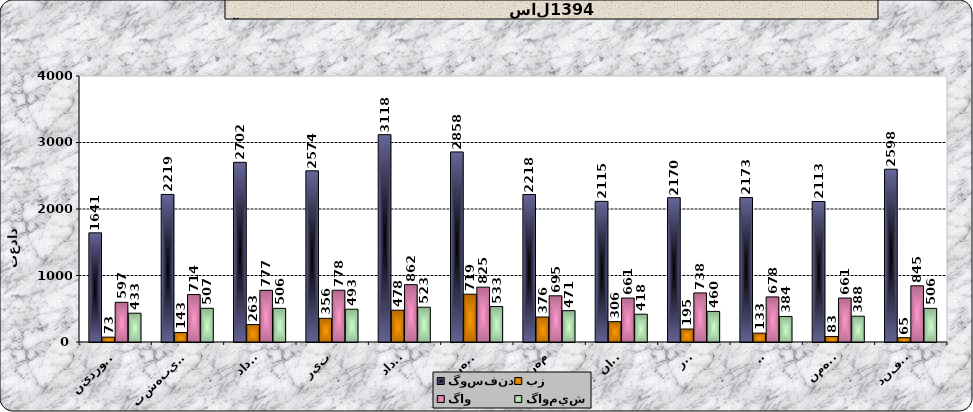
| Category | گوسفند | بز | گاو | گاوميش |
|---|---|---|---|---|
| فروردين | 1641 | 73 | 597 | 433 |
| ارديبهشت | 2219 | 143 | 714 | 507 |
| خرداد | 2702 | 263 | 777 | 506 |
| تير | 2574 | 356 | 778 | 493 |
| مرداد | 3118 | 478 | 862 | 523 |
| شهريور | 2858 | 719 | 825 | 533 |
| مهر | 2218 | 376 | 695 | 471 |
| آبان | 2115 | 306 | 661 | 418 |
| آذر | 2170 | 195 | 738 | 460 |
| دي | 2173 | 133 | 678 | 384 |
| بهمن | 2113 | 83 | 661 | 388 |
| اسفند | 2598 | 65 | 845 | 506 |